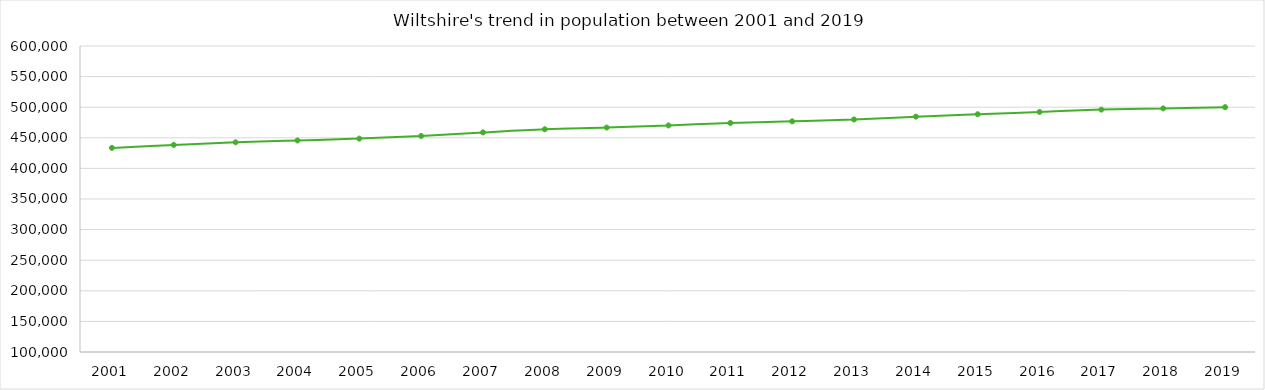
| Category | Total |
|---|---|
| 2001.0 | 433508 |
| 2002.0 | 438386 |
| 2003.0 | 442633 |
| 2004.0 | 445632 |
| 2005.0 | 448670 |
| 2006.0 | 453041 |
| 2007.0 | 458840 |
| 2008.0 | 464007 |
| 2009.0 | 466711 |
| 2010.0 | 470199 |
| 2011.0 | 474319 |
| 2012.0 | 476914 |
| 2013.0 | 479911 |
| 2014.0 | 484560 |
| 2015.0 | 488487 |
| 2016.0 | 492240 |
| 2017.0 | 496043 |
| 2018.0 | 498064 |
| 2019.0 | 500024 |